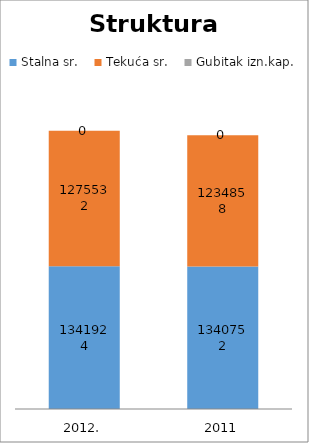
| Category | Stalna sr. | Tekuća sr. | Gubitak izn.kap. |
|---|---|---|---|
| 2012. | 1341924 | 1275532 | 0 |
| 2011 | 1340752 | 1234858 | 0 |